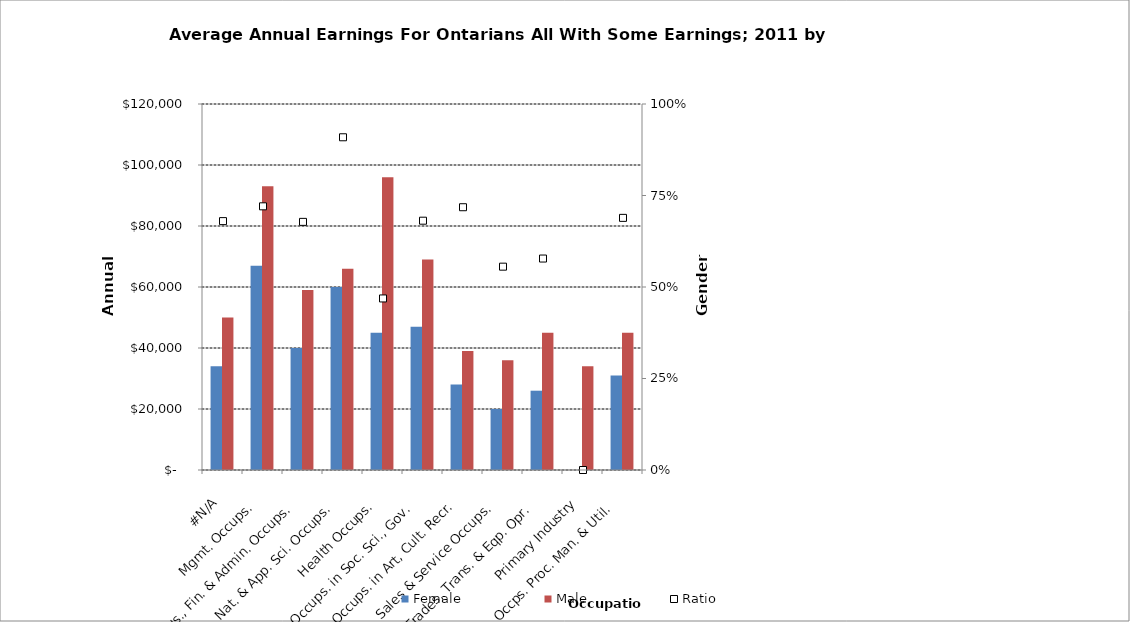
| Category | Female | Male |
|---|---|---|
|  #N/A  | 34000 | 50000 |
|  Mgmt. Occups.  | 67000 | 93000 |
|  Bus., Fin. & Admin. Occups.  | 40000 | 59000 |
|  Nat. & App. Sci. Occups.  | 60000 | 66000 |
|  Health Occups.  | 45000 | 96000 |
|  Occups. in Soc. Sci., Gov.  | 47000 | 69000 |
|  Occups. in Art, Cult. Recr.  | 28000 | 39000 |
|  Sales & Service Occups.  | 20000 | 36000 |
|  Trades, Trans. & Eqp. Opr.   | 26000 | 45000 |
|  Primary Industry  | 0 | 34000 |
|  Occps. Proc. Man. & Util.  | 31000 | 45000 |